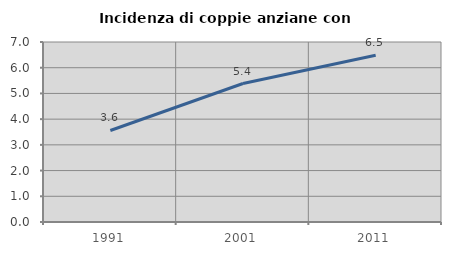
| Category | Incidenza di coppie anziane con figli |
|---|---|
| 1991.0 | 3.559 |
| 2001.0 | 5.385 |
| 2011.0 | 6.486 |